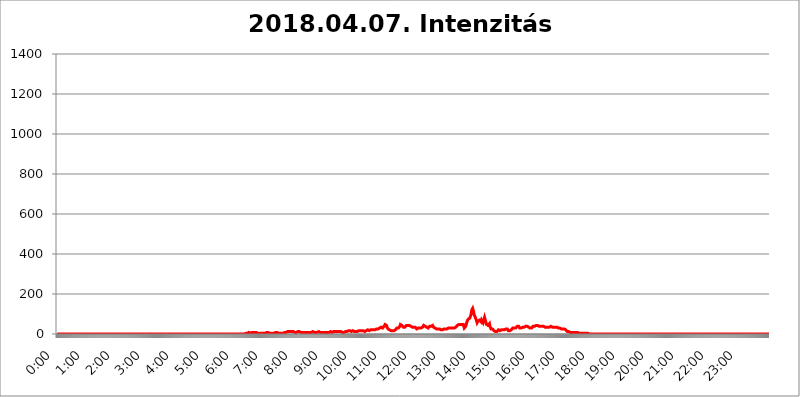
| Category | 2018.04.07. Intenzitás [W/m^2] |
|---|---|
| 0.0 | 0 |
| 0.0006944444444444445 | 0 |
| 0.001388888888888889 | 0 |
| 0.0020833333333333333 | 0 |
| 0.002777777777777778 | 0 |
| 0.003472222222222222 | 0 |
| 0.004166666666666667 | 0 |
| 0.004861111111111111 | 0 |
| 0.005555555555555556 | 0 |
| 0.0062499999999999995 | 0 |
| 0.006944444444444444 | 0 |
| 0.007638888888888889 | 0 |
| 0.008333333333333333 | 0 |
| 0.009027777777777779 | 0 |
| 0.009722222222222222 | 0 |
| 0.010416666666666666 | 0 |
| 0.011111111111111112 | 0 |
| 0.011805555555555555 | 0 |
| 0.012499999999999999 | 0 |
| 0.013194444444444444 | 0 |
| 0.013888888888888888 | 0 |
| 0.014583333333333332 | 0 |
| 0.015277777777777777 | 0 |
| 0.015972222222222224 | 0 |
| 0.016666666666666666 | 0 |
| 0.017361111111111112 | 0 |
| 0.018055555555555557 | 0 |
| 0.01875 | 0 |
| 0.019444444444444445 | 0 |
| 0.02013888888888889 | 0 |
| 0.020833333333333332 | 0 |
| 0.02152777777777778 | 0 |
| 0.022222222222222223 | 0 |
| 0.02291666666666667 | 0 |
| 0.02361111111111111 | 0 |
| 0.024305555555555556 | 0 |
| 0.024999999999999998 | 0 |
| 0.025694444444444447 | 0 |
| 0.02638888888888889 | 0 |
| 0.027083333333333334 | 0 |
| 0.027777777777777776 | 0 |
| 0.02847222222222222 | 0 |
| 0.029166666666666664 | 0 |
| 0.029861111111111113 | 0 |
| 0.030555555555555555 | 0 |
| 0.03125 | 0 |
| 0.03194444444444445 | 0 |
| 0.03263888888888889 | 0 |
| 0.03333333333333333 | 0 |
| 0.034027777777777775 | 0 |
| 0.034722222222222224 | 0 |
| 0.035416666666666666 | 0 |
| 0.036111111111111115 | 0 |
| 0.03680555555555556 | 0 |
| 0.0375 | 0 |
| 0.03819444444444444 | 0 |
| 0.03888888888888889 | 0 |
| 0.03958333333333333 | 0 |
| 0.04027777777777778 | 0 |
| 0.04097222222222222 | 0 |
| 0.041666666666666664 | 0 |
| 0.042361111111111106 | 0 |
| 0.04305555555555556 | 0 |
| 0.043750000000000004 | 0 |
| 0.044444444444444446 | 0 |
| 0.04513888888888889 | 0 |
| 0.04583333333333334 | 0 |
| 0.04652777777777778 | 0 |
| 0.04722222222222222 | 0 |
| 0.04791666666666666 | 0 |
| 0.04861111111111111 | 0 |
| 0.049305555555555554 | 0 |
| 0.049999999999999996 | 0 |
| 0.05069444444444445 | 0 |
| 0.051388888888888894 | 0 |
| 0.052083333333333336 | 0 |
| 0.05277777777777778 | 0 |
| 0.05347222222222222 | 0 |
| 0.05416666666666667 | 0 |
| 0.05486111111111111 | 0 |
| 0.05555555555555555 | 0 |
| 0.05625 | 0 |
| 0.05694444444444444 | 0 |
| 0.057638888888888885 | 0 |
| 0.05833333333333333 | 0 |
| 0.05902777777777778 | 0 |
| 0.059722222222222225 | 0 |
| 0.06041666666666667 | 0 |
| 0.061111111111111116 | 0 |
| 0.06180555555555556 | 0 |
| 0.0625 | 0 |
| 0.06319444444444444 | 0 |
| 0.06388888888888888 | 0 |
| 0.06458333333333334 | 0 |
| 0.06527777777777778 | 0 |
| 0.06597222222222222 | 0 |
| 0.06666666666666667 | 0 |
| 0.06736111111111111 | 0 |
| 0.06805555555555555 | 0 |
| 0.06874999999999999 | 0 |
| 0.06944444444444443 | 0 |
| 0.07013888888888889 | 0 |
| 0.07083333333333333 | 0 |
| 0.07152777777777779 | 0 |
| 0.07222222222222223 | 0 |
| 0.07291666666666667 | 0 |
| 0.07361111111111111 | 0 |
| 0.07430555555555556 | 0 |
| 0.075 | 0 |
| 0.07569444444444444 | 0 |
| 0.0763888888888889 | 0 |
| 0.07708333333333334 | 0 |
| 0.07777777777777778 | 0 |
| 0.07847222222222222 | 0 |
| 0.07916666666666666 | 0 |
| 0.0798611111111111 | 0 |
| 0.08055555555555556 | 0 |
| 0.08125 | 0 |
| 0.08194444444444444 | 0 |
| 0.08263888888888889 | 0 |
| 0.08333333333333333 | 0 |
| 0.08402777777777777 | 0 |
| 0.08472222222222221 | 0 |
| 0.08541666666666665 | 0 |
| 0.08611111111111112 | 0 |
| 0.08680555555555557 | 0 |
| 0.08750000000000001 | 0 |
| 0.08819444444444445 | 0 |
| 0.08888888888888889 | 0 |
| 0.08958333333333333 | 0 |
| 0.09027777777777778 | 0 |
| 0.09097222222222222 | 0 |
| 0.09166666666666667 | 0 |
| 0.09236111111111112 | 0 |
| 0.09305555555555556 | 0 |
| 0.09375 | 0 |
| 0.09444444444444444 | 0 |
| 0.09513888888888888 | 0 |
| 0.09583333333333333 | 0 |
| 0.09652777777777777 | 0 |
| 0.09722222222222222 | 0 |
| 0.09791666666666667 | 0 |
| 0.09861111111111111 | 0 |
| 0.09930555555555555 | 0 |
| 0.09999999999999999 | 0 |
| 0.10069444444444443 | 0 |
| 0.1013888888888889 | 0 |
| 0.10208333333333335 | 0 |
| 0.10277777777777779 | 0 |
| 0.10347222222222223 | 0 |
| 0.10416666666666667 | 0 |
| 0.10486111111111111 | 0 |
| 0.10555555555555556 | 0 |
| 0.10625 | 0 |
| 0.10694444444444444 | 0 |
| 0.1076388888888889 | 0 |
| 0.10833333333333334 | 0 |
| 0.10902777777777778 | 0 |
| 0.10972222222222222 | 0 |
| 0.1111111111111111 | 0 |
| 0.11180555555555556 | 0 |
| 0.11180555555555556 | 0 |
| 0.1125 | 0 |
| 0.11319444444444444 | 0 |
| 0.11388888888888889 | 0 |
| 0.11458333333333333 | 0 |
| 0.11527777777777777 | 0 |
| 0.11597222222222221 | 0 |
| 0.11666666666666665 | 0 |
| 0.1173611111111111 | 0 |
| 0.11805555555555557 | 0 |
| 0.11944444444444445 | 0 |
| 0.12013888888888889 | 0 |
| 0.12083333333333333 | 0 |
| 0.12152777777777778 | 0 |
| 0.12222222222222223 | 0 |
| 0.12291666666666667 | 0 |
| 0.12291666666666667 | 0 |
| 0.12361111111111112 | 0 |
| 0.12430555555555556 | 0 |
| 0.125 | 0 |
| 0.12569444444444444 | 0 |
| 0.12638888888888888 | 0 |
| 0.12708333333333333 | 0 |
| 0.16875 | 0 |
| 0.12847222222222224 | 0 |
| 0.12916666666666668 | 0 |
| 0.12986111111111112 | 0 |
| 0.13055555555555556 | 0 |
| 0.13125 | 0 |
| 0.13194444444444445 | 0 |
| 0.1326388888888889 | 0 |
| 0.13333333333333333 | 0 |
| 0.13402777777777777 | 0 |
| 0.13402777777777777 | 0 |
| 0.13472222222222222 | 0 |
| 0.13541666666666666 | 0 |
| 0.1361111111111111 | 0 |
| 0.13749999999999998 | 0 |
| 0.13819444444444443 | 0 |
| 0.1388888888888889 | 0 |
| 0.13958333333333334 | 0 |
| 0.14027777777777778 | 0 |
| 0.14097222222222222 | 0 |
| 0.14166666666666666 | 0 |
| 0.1423611111111111 | 0 |
| 0.14305555555555557 | 0 |
| 0.14375000000000002 | 0 |
| 0.14444444444444446 | 0 |
| 0.1451388888888889 | 0 |
| 0.1451388888888889 | 0 |
| 0.14652777777777778 | 0 |
| 0.14722222222222223 | 0 |
| 0.14791666666666667 | 0 |
| 0.1486111111111111 | 0 |
| 0.14930555555555555 | 0 |
| 0.15 | 0 |
| 0.15069444444444444 | 0 |
| 0.15138888888888888 | 0 |
| 0.15208333333333332 | 0 |
| 0.15277777777777776 | 0 |
| 0.15347222222222223 | 0 |
| 0.15416666666666667 | 0 |
| 0.15486111111111112 | 0 |
| 0.15555555555555556 | 0 |
| 0.15625 | 0 |
| 0.15694444444444444 | 0 |
| 0.15763888888888888 | 0 |
| 0.15833333333333333 | 0 |
| 0.15902777777777777 | 0 |
| 0.15972222222222224 | 0 |
| 0.16041666666666668 | 0 |
| 0.16111111111111112 | 0 |
| 0.16180555555555556 | 0 |
| 0.1625 | 0 |
| 0.16319444444444445 | 0 |
| 0.1638888888888889 | 0 |
| 0.16458333333333333 | 0 |
| 0.16527777777777777 | 0 |
| 0.16597222222222222 | 0 |
| 0.16666666666666666 | 0 |
| 0.1673611111111111 | 0 |
| 0.16805555555555554 | 0 |
| 0.16874999999999998 | 0 |
| 0.16944444444444443 | 0 |
| 0.17013888888888887 | 0 |
| 0.1708333333333333 | 0 |
| 0.17152777777777775 | 0 |
| 0.17222222222222225 | 0 |
| 0.1729166666666667 | 0 |
| 0.17361111111111113 | 0 |
| 0.17430555555555557 | 0 |
| 0.17500000000000002 | 0 |
| 0.17569444444444446 | 0 |
| 0.1763888888888889 | 0 |
| 0.17708333333333334 | 0 |
| 0.17777777777777778 | 0 |
| 0.17847222222222223 | 0 |
| 0.17916666666666667 | 0 |
| 0.1798611111111111 | 0 |
| 0.18055555555555555 | 0 |
| 0.18125 | 0 |
| 0.18194444444444444 | 0 |
| 0.1826388888888889 | 0 |
| 0.18333333333333335 | 0 |
| 0.1840277777777778 | 0 |
| 0.18472222222222223 | 0 |
| 0.18541666666666667 | 0 |
| 0.18611111111111112 | 0 |
| 0.18680555555555556 | 0 |
| 0.1875 | 0 |
| 0.18819444444444444 | 0 |
| 0.18888888888888888 | 0 |
| 0.18958333333333333 | 0 |
| 0.19027777777777777 | 0 |
| 0.1909722222222222 | 0 |
| 0.19166666666666665 | 0 |
| 0.19236111111111112 | 0 |
| 0.19305555555555554 | 0 |
| 0.19375 | 0 |
| 0.19444444444444445 | 0 |
| 0.1951388888888889 | 0 |
| 0.19583333333333333 | 0 |
| 0.19652777777777777 | 0 |
| 0.19722222222222222 | 0 |
| 0.19791666666666666 | 0 |
| 0.1986111111111111 | 0 |
| 0.19930555555555554 | 0 |
| 0.19999999999999998 | 0 |
| 0.20069444444444443 | 0 |
| 0.20138888888888887 | 0 |
| 0.2020833333333333 | 0 |
| 0.2027777777777778 | 0 |
| 0.2034722222222222 | 0 |
| 0.2041666666666667 | 0 |
| 0.20486111111111113 | 0 |
| 0.20555555555555557 | 0 |
| 0.20625000000000002 | 0 |
| 0.20694444444444446 | 0 |
| 0.2076388888888889 | 0 |
| 0.20833333333333334 | 0 |
| 0.20902777777777778 | 0 |
| 0.20972222222222223 | 0 |
| 0.21041666666666667 | 0 |
| 0.2111111111111111 | 0 |
| 0.21180555555555555 | 0 |
| 0.2125 | 0 |
| 0.21319444444444444 | 0 |
| 0.2138888888888889 | 0 |
| 0.21458333333333335 | 0 |
| 0.2152777777777778 | 0 |
| 0.21597222222222223 | 0 |
| 0.21666666666666667 | 0 |
| 0.21736111111111112 | 0 |
| 0.21805555555555556 | 0 |
| 0.21875 | 0 |
| 0.21944444444444444 | 0 |
| 0.22013888888888888 | 0 |
| 0.22083333333333333 | 0 |
| 0.22152777777777777 | 0 |
| 0.2222222222222222 | 0 |
| 0.22291666666666665 | 0 |
| 0.2236111111111111 | 0 |
| 0.22430555555555556 | 0 |
| 0.225 | 0 |
| 0.22569444444444445 | 0 |
| 0.2263888888888889 | 0 |
| 0.22708333333333333 | 0 |
| 0.22777777777777777 | 0 |
| 0.22847222222222222 | 0 |
| 0.22916666666666666 | 0 |
| 0.2298611111111111 | 0 |
| 0.23055555555555554 | 0 |
| 0.23124999999999998 | 0 |
| 0.23194444444444443 | 0 |
| 0.23263888888888887 | 0 |
| 0.2333333333333333 | 0 |
| 0.2340277777777778 | 0 |
| 0.2347222222222222 | 0 |
| 0.2354166666666667 | 0 |
| 0.23611111111111113 | 0 |
| 0.23680555555555557 | 0 |
| 0.23750000000000002 | 0 |
| 0.23819444444444446 | 0 |
| 0.2388888888888889 | 0 |
| 0.23958333333333334 | 0 |
| 0.24027777777777778 | 0 |
| 0.24097222222222223 | 0 |
| 0.24166666666666667 | 0 |
| 0.2423611111111111 | 0 |
| 0.24305555555555555 | 0 |
| 0.24375 | 0 |
| 0.24444444444444446 | 0 |
| 0.24513888888888888 | 0 |
| 0.24583333333333335 | 0 |
| 0.2465277777777778 | 0 |
| 0.24722222222222223 | 0 |
| 0.24791666666666667 | 0 |
| 0.24861111111111112 | 0 |
| 0.24930555555555556 | 0 |
| 0.25 | 0 |
| 0.25069444444444444 | 0 |
| 0.2513888888888889 | 3.525 |
| 0.2520833333333333 | 0 |
| 0.25277777777777777 | 0 |
| 0.2534722222222222 | 3.525 |
| 0.25416666666666665 | 0 |
| 0.2548611111111111 | 0 |
| 0.2555555555555556 | 0 |
| 0.25625000000000003 | 0 |
| 0.2569444444444445 | 0 |
| 0.2576388888888889 | 0 |
| 0.25833333333333336 | 0 |
| 0.2590277777777778 | 0 |
| 0.25972222222222224 | 0 |
| 0.2604166666666667 | 0 |
| 0.2611111111111111 | 3.525 |
| 0.26180555555555557 | 3.525 |
| 0.2625 | 0 |
| 0.26319444444444445 | 3.525 |
| 0.2638888888888889 | 3.525 |
| 0.26458333333333334 | 3.525 |
| 0.2652777777777778 | 3.525 |
| 0.2659722222222222 | 3.525 |
| 0.26666666666666666 | 3.525 |
| 0.2673611111111111 | 7.887 |
| 0.26805555555555555 | 7.887 |
| 0.26875 | 7.887 |
| 0.26944444444444443 | 3.525 |
| 0.2701388888888889 | 7.887 |
| 0.2708333333333333 | 3.525 |
| 0.27152777777777776 | 3.525 |
| 0.2722222222222222 | 7.887 |
| 0.27291666666666664 | 7.887 |
| 0.2736111111111111 | 7.887 |
| 0.2743055555555555 | 7.887 |
| 0.27499999999999997 | 7.887 |
| 0.27569444444444446 | 7.887 |
| 0.27638888888888885 | 7.887 |
| 0.27708333333333335 | 7.887 |
| 0.2777777777777778 | 7.887 |
| 0.27847222222222223 | 7.887 |
| 0.2791666666666667 | 7.887 |
| 0.2798611111111111 | 7.887 |
| 0.28055555555555556 | 3.525 |
| 0.28125 | 3.525 |
| 0.28194444444444444 | 3.525 |
| 0.2826388888888889 | 3.525 |
| 0.2833333333333333 | 3.525 |
| 0.28402777777777777 | 3.525 |
| 0.2847222222222222 | 3.525 |
| 0.28541666666666665 | 3.525 |
| 0.28611111111111115 | 3.525 |
| 0.28680555555555554 | 3.525 |
| 0.28750000000000003 | 3.525 |
| 0.2881944444444445 | 3.525 |
| 0.2888888888888889 | 3.525 |
| 0.28958333333333336 | 3.525 |
| 0.2902777777777778 | 3.525 |
| 0.29097222222222224 | 3.525 |
| 0.2916666666666667 | 3.525 |
| 0.2923611111111111 | 7.887 |
| 0.29305555555555557 | 3.525 |
| 0.29375 | 7.887 |
| 0.29444444444444445 | 7.887 |
| 0.2951388888888889 | 7.887 |
| 0.29583333333333334 | 7.887 |
| 0.2965277777777778 | 7.887 |
| 0.2972222222222222 | 3.525 |
| 0.29791666666666666 | 3.525 |
| 0.2986111111111111 | 3.525 |
| 0.29930555555555555 | 3.525 |
| 0.3 | 3.525 |
| 0.30069444444444443 | 3.525 |
| 0.3013888888888889 | 3.525 |
| 0.3020833333333333 | 3.525 |
| 0.30277777777777776 | 3.525 |
| 0.3034722222222222 | 3.525 |
| 0.30416666666666664 | 3.525 |
| 0.3048611111111111 | 3.525 |
| 0.3055555555555555 | 7.887 |
| 0.30624999999999997 | 7.887 |
| 0.3069444444444444 | 7.887 |
| 0.3076388888888889 | 7.887 |
| 0.30833333333333335 | 7.887 |
| 0.3090277777777778 | 7.887 |
| 0.30972222222222223 | 3.525 |
| 0.3104166666666667 | 3.525 |
| 0.3111111111111111 | 3.525 |
| 0.31180555555555556 | 3.525 |
| 0.3125 | 3.525 |
| 0.31319444444444444 | 3.525 |
| 0.3138888888888889 | 3.525 |
| 0.3145833333333333 | 3.525 |
| 0.31527777777777777 | 3.525 |
| 0.3159722222222222 | 3.525 |
| 0.31666666666666665 | 3.525 |
| 0.31736111111111115 | 3.525 |
| 0.31805555555555554 | 7.887 |
| 0.31875000000000003 | 7.887 |
| 0.3194444444444445 | 7.887 |
| 0.3201388888888889 | 7.887 |
| 0.32083333333333336 | 7.887 |
| 0.3215277777777778 | 12.257 |
| 0.32222222222222224 | 12.257 |
| 0.3229166666666667 | 12.257 |
| 0.3236111111111111 | 12.257 |
| 0.32430555555555557 | 12.257 |
| 0.325 | 12.257 |
| 0.32569444444444445 | 12.257 |
| 0.3263888888888889 | 12.257 |
| 0.32708333333333334 | 12.257 |
| 0.3277777777777778 | 12.257 |
| 0.3284722222222222 | 12.257 |
| 0.32916666666666666 | 12.257 |
| 0.3298611111111111 | 12.257 |
| 0.33055555555555555 | 12.257 |
| 0.33125 | 12.257 |
| 0.33194444444444443 | 12.257 |
| 0.3326388888888889 | 12.257 |
| 0.3333333333333333 | 7.887 |
| 0.3340277777777778 | 12.257 |
| 0.3347222222222222 | 7.887 |
| 0.3354166666666667 | 7.887 |
| 0.3361111111111111 | 7.887 |
| 0.3368055555555556 | 12.257 |
| 0.33749999999999997 | 12.257 |
| 0.33819444444444446 | 12.257 |
| 0.33888888888888885 | 12.257 |
| 0.33958333333333335 | 12.257 |
| 0.34027777777777773 | 12.257 |
| 0.34097222222222223 | 12.257 |
| 0.3416666666666666 | 7.887 |
| 0.3423611111111111 | 7.887 |
| 0.3430555555555555 | 7.887 |
| 0.34375 | 7.887 |
| 0.3444444444444445 | 7.887 |
| 0.3451388888888889 | 7.887 |
| 0.3458333333333334 | 7.887 |
| 0.34652777777777777 | 7.887 |
| 0.34722222222222227 | 7.887 |
| 0.34791666666666665 | 7.887 |
| 0.34861111111111115 | 7.887 |
| 0.34930555555555554 | 7.887 |
| 0.35000000000000003 | 7.887 |
| 0.3506944444444444 | 7.887 |
| 0.3513888888888889 | 7.887 |
| 0.3520833333333333 | 7.887 |
| 0.3527777777777778 | 7.887 |
| 0.3534722222222222 | 7.887 |
| 0.3541666666666667 | 7.887 |
| 0.3548611111111111 | 7.887 |
| 0.35555555555555557 | 7.887 |
| 0.35625 | 7.887 |
| 0.35694444444444445 | 7.887 |
| 0.3576388888888889 | 7.887 |
| 0.35833333333333334 | 12.257 |
| 0.3590277777777778 | 7.887 |
| 0.3597222222222222 | 7.887 |
| 0.36041666666666666 | 7.887 |
| 0.3611111111111111 | 7.887 |
| 0.36180555555555555 | 7.887 |
| 0.3625 | 7.887 |
| 0.36319444444444443 | 7.887 |
| 0.3638888888888889 | 7.887 |
| 0.3645833333333333 | 7.887 |
| 0.3652777777777778 | 7.887 |
| 0.3659722222222222 | 7.887 |
| 0.3666666666666667 | 12.257 |
| 0.3673611111111111 | 7.887 |
| 0.3680555555555556 | 7.887 |
| 0.36874999999999997 | 7.887 |
| 0.36944444444444446 | 7.887 |
| 0.37013888888888885 | 7.887 |
| 0.37083333333333335 | 7.887 |
| 0.37152777777777773 | 7.887 |
| 0.37222222222222223 | 7.887 |
| 0.3729166666666666 | 7.887 |
| 0.3736111111111111 | 7.887 |
| 0.3743055555555555 | 7.887 |
| 0.375 | 7.887 |
| 0.3756944444444445 | 7.887 |
| 0.3763888888888889 | 7.887 |
| 0.3770833333333334 | 7.887 |
| 0.37777777777777777 | 7.887 |
| 0.37847222222222227 | 7.887 |
| 0.37916666666666665 | 7.887 |
| 0.37986111111111115 | 7.887 |
| 0.38055555555555554 | 7.887 |
| 0.38125000000000003 | 7.887 |
| 0.3819444444444444 | 12.257 |
| 0.3826388888888889 | 12.257 |
| 0.3833333333333333 | 12.257 |
| 0.3840277777777778 | 12.257 |
| 0.3847222222222222 | 12.257 |
| 0.3854166666666667 | 7.887 |
| 0.3861111111111111 | 7.887 |
| 0.38680555555555557 | 7.887 |
| 0.3875 | 12.257 |
| 0.38819444444444445 | 12.257 |
| 0.3888888888888889 | 12.257 |
| 0.38958333333333334 | 12.257 |
| 0.3902777777777778 | 12.257 |
| 0.3909722222222222 | 12.257 |
| 0.39166666666666666 | 12.257 |
| 0.3923611111111111 | 12.257 |
| 0.39305555555555555 | 12.257 |
| 0.39375 | 12.257 |
| 0.39444444444444443 | 12.257 |
| 0.3951388888888889 | 12.257 |
| 0.3958333333333333 | 12.257 |
| 0.3965277777777778 | 12.257 |
| 0.3972222222222222 | 12.257 |
| 0.3979166666666667 | 12.257 |
| 0.3986111111111111 | 7.887 |
| 0.3993055555555556 | 7.887 |
| 0.39999999999999997 | 7.887 |
| 0.40069444444444446 | 7.887 |
| 0.40138888888888885 | 7.887 |
| 0.40208333333333335 | 7.887 |
| 0.40277777777777773 | 7.887 |
| 0.40347222222222223 | 12.257 |
| 0.4041666666666666 | 12.257 |
| 0.4048611111111111 | 12.257 |
| 0.4055555555555555 | 12.257 |
| 0.40625 | 12.257 |
| 0.4069444444444445 | 12.257 |
| 0.4076388888888889 | 12.257 |
| 0.4083333333333334 | 16.636 |
| 0.40902777777777777 | 16.636 |
| 0.40972222222222227 | 16.636 |
| 0.41041666666666665 | 16.636 |
| 0.41111111111111115 | 16.636 |
| 0.41180555555555554 | 12.257 |
| 0.41250000000000003 | 12.257 |
| 0.4131944444444444 | 16.636 |
| 0.4138888888888889 | 12.257 |
| 0.4145833333333333 | 16.636 |
| 0.4152777777777778 | 12.257 |
| 0.4159722222222222 | 12.257 |
| 0.4166666666666667 | 12.257 |
| 0.4173611111111111 | 12.257 |
| 0.41805555555555557 | 12.257 |
| 0.41875 | 12.257 |
| 0.41944444444444445 | 12.257 |
| 0.4201388888888889 | 12.257 |
| 0.42083333333333334 | 12.257 |
| 0.4215277777777778 | 16.636 |
| 0.4222222222222222 | 16.636 |
| 0.42291666666666666 | 16.636 |
| 0.4236111111111111 | 16.636 |
| 0.42430555555555555 | 16.636 |
| 0.425 | 16.636 |
| 0.42569444444444443 | 16.636 |
| 0.4263888888888889 | 16.636 |
| 0.4270833333333333 | 16.636 |
| 0.4277777777777778 | 16.636 |
| 0.4284722222222222 | 16.636 |
| 0.4291666666666667 | 16.636 |
| 0.4298611111111111 | 12.257 |
| 0.4305555555555556 | 12.257 |
| 0.43124999999999997 | 12.257 |
| 0.43194444444444446 | 12.257 |
| 0.43263888888888885 | 16.636 |
| 0.43333333333333335 | 16.636 |
| 0.43402777777777773 | 16.636 |
| 0.43472222222222223 | 21.024 |
| 0.4354166666666666 | 21.024 |
| 0.4361111111111111 | 16.636 |
| 0.4368055555555555 | 16.636 |
| 0.4375 | 16.636 |
| 0.4381944444444445 | 16.636 |
| 0.4388888888888889 | 16.636 |
| 0.4395833333333334 | 21.024 |
| 0.44027777777777777 | 16.636 |
| 0.44097222222222227 | 16.636 |
| 0.44166666666666665 | 21.024 |
| 0.44236111111111115 | 21.024 |
| 0.44305555555555554 | 21.024 |
| 0.44375000000000003 | 21.024 |
| 0.4444444444444444 | 21.024 |
| 0.4451388888888889 | 21.024 |
| 0.4458333333333333 | 21.024 |
| 0.4465277777777778 | 25.419 |
| 0.4472222222222222 | 25.419 |
| 0.4479166666666667 | 25.419 |
| 0.4486111111111111 | 25.419 |
| 0.44930555555555557 | 25.419 |
| 0.45 | 25.419 |
| 0.45069444444444445 | 29.823 |
| 0.4513888888888889 | 29.823 |
| 0.45208333333333334 | 29.823 |
| 0.4527777777777778 | 29.823 |
| 0.4534722222222222 | 34.234 |
| 0.45416666666666666 | 34.234 |
| 0.4548611111111111 | 34.234 |
| 0.45555555555555555 | 34.234 |
| 0.45625 | 29.823 |
| 0.45694444444444443 | 29.823 |
| 0.4576388888888889 | 34.234 |
| 0.4583333333333333 | 38.653 |
| 0.4590277777777778 | 43.079 |
| 0.4597222222222222 | 47.511 |
| 0.4604166666666667 | 51.951 |
| 0.4611111111111111 | 47.511 |
| 0.4618055555555556 | 43.079 |
| 0.46249999999999997 | 34.234 |
| 0.46319444444444446 | 29.823 |
| 0.46388888888888885 | 25.419 |
| 0.46458333333333335 | 25.419 |
| 0.46527777777777773 | 21.024 |
| 0.46597222222222223 | 21.024 |
| 0.4666666666666666 | 21.024 |
| 0.4673611111111111 | 21.024 |
| 0.4680555555555555 | 16.636 |
| 0.46875 | 16.636 |
| 0.4694444444444445 | 16.636 |
| 0.4701388888888889 | 16.636 |
| 0.4708333333333334 | 16.636 |
| 0.47152777777777777 | 16.636 |
| 0.47222222222222227 | 16.636 |
| 0.47291666666666665 | 16.636 |
| 0.47361111111111115 | 21.024 |
| 0.47430555555555554 | 21.024 |
| 0.47500000000000003 | 25.419 |
| 0.4756944444444444 | 25.419 |
| 0.4763888888888889 | 29.823 |
| 0.4770833333333333 | 29.823 |
| 0.4777777777777778 | 29.823 |
| 0.4784722222222222 | 29.823 |
| 0.4791666666666667 | 29.823 |
| 0.4798611111111111 | 34.234 |
| 0.48055555555555557 | 38.653 |
| 0.48125 | 47.511 |
| 0.48194444444444445 | 51.951 |
| 0.4826388888888889 | 47.511 |
| 0.48333333333333334 | 43.079 |
| 0.4840277777777778 | 38.653 |
| 0.4847222222222222 | 38.653 |
| 0.48541666666666666 | 34.234 |
| 0.4861111111111111 | 34.234 |
| 0.48680555555555555 | 34.234 |
| 0.4875 | 34.234 |
| 0.48819444444444443 | 38.653 |
| 0.4888888888888889 | 38.653 |
| 0.4895833333333333 | 43.079 |
| 0.4902777777777778 | 43.079 |
| 0.4909722222222222 | 43.079 |
| 0.4916666666666667 | 43.079 |
| 0.4923611111111111 | 43.079 |
| 0.4930555555555556 | 43.079 |
| 0.49374999999999997 | 43.079 |
| 0.49444444444444446 | 43.079 |
| 0.49513888888888885 | 43.079 |
| 0.49583333333333335 | 38.653 |
| 0.49652777777777773 | 38.653 |
| 0.49722222222222223 | 38.653 |
| 0.4979166666666666 | 34.234 |
| 0.4986111111111111 | 34.234 |
| 0.4993055555555555 | 34.234 |
| 0.5 | 34.234 |
| 0.5006944444444444 | 34.234 |
| 0.5013888888888889 | 34.234 |
| 0.5020833333333333 | 34.234 |
| 0.5027777777777778 | 29.823 |
| 0.5034722222222222 | 29.823 |
| 0.5041666666666667 | 25.419 |
| 0.5048611111111111 | 25.419 |
| 0.5055555555555555 | 29.823 |
| 0.50625 | 29.823 |
| 0.5069444444444444 | 29.823 |
| 0.5076388888888889 | 29.823 |
| 0.5083333333333333 | 29.823 |
| 0.5090277777777777 | 29.823 |
| 0.5097222222222222 | 29.823 |
| 0.5104166666666666 | 29.823 |
| 0.5111111111111112 | 29.823 |
| 0.5118055555555555 | 29.823 |
| 0.5125000000000001 | 34.234 |
| 0.5131944444444444 | 38.653 |
| 0.513888888888889 | 43.079 |
| 0.5145833333333333 | 43.079 |
| 0.5152777777777778 | 38.653 |
| 0.5159722222222222 | 38.653 |
| 0.5166666666666667 | 34.234 |
| 0.517361111111111 | 34.234 |
| 0.5180555555555556 | 34.234 |
| 0.5187499999999999 | 29.823 |
| 0.5194444444444445 | 29.823 |
| 0.5201388888888888 | 29.823 |
| 0.5208333333333334 | 34.234 |
| 0.5215277777777778 | 34.234 |
| 0.5222222222222223 | 38.653 |
| 0.5229166666666667 | 38.653 |
| 0.5236111111111111 | 34.234 |
| 0.5243055555555556 | 38.653 |
| 0.525 | 38.653 |
| 0.5256944444444445 | 43.079 |
| 0.5263888888888889 | 43.079 |
| 0.5270833333333333 | 38.653 |
| 0.5277777777777778 | 34.234 |
| 0.5284722222222222 | 29.823 |
| 0.5291666666666667 | 34.234 |
| 0.5298611111111111 | 29.823 |
| 0.5305555555555556 | 29.823 |
| 0.53125 | 29.823 |
| 0.5319444444444444 | 25.419 |
| 0.5326388888888889 | 25.419 |
| 0.5333333333333333 | 25.419 |
| 0.5340277777777778 | 25.419 |
| 0.5347222222222222 | 25.419 |
| 0.5354166666666667 | 25.419 |
| 0.5361111111111111 | 25.419 |
| 0.5368055555555555 | 25.419 |
| 0.5375 | 25.419 |
| 0.5381944444444444 | 21.024 |
| 0.5388888888888889 | 21.024 |
| 0.5395833333333333 | 21.024 |
| 0.5402777777777777 | 21.024 |
| 0.5409722222222222 | 25.419 |
| 0.5416666666666666 | 25.419 |
| 0.5423611111111112 | 25.419 |
| 0.5430555555555555 | 25.419 |
| 0.5437500000000001 | 25.419 |
| 0.5444444444444444 | 25.419 |
| 0.545138888888889 | 25.419 |
| 0.5458333333333333 | 25.419 |
| 0.5465277777777778 | 25.419 |
| 0.5472222222222222 | 29.823 |
| 0.5479166666666667 | 29.823 |
| 0.548611111111111 | 29.823 |
| 0.5493055555555556 | 29.823 |
| 0.5499999999999999 | 29.823 |
| 0.5506944444444445 | 29.823 |
| 0.5513888888888888 | 29.823 |
| 0.5520833333333334 | 29.823 |
| 0.5527777777777778 | 29.823 |
| 0.5534722222222223 | 29.823 |
| 0.5541666666666667 | 29.823 |
| 0.5548611111111111 | 29.823 |
| 0.5555555555555556 | 29.823 |
| 0.55625 | 29.823 |
| 0.5569444444444445 | 29.823 |
| 0.5576388888888889 | 29.823 |
| 0.5583333333333333 | 29.823 |
| 0.5590277777777778 | 34.234 |
| 0.5597222222222222 | 38.653 |
| 0.5604166666666667 | 38.653 |
| 0.5611111111111111 | 43.079 |
| 0.5618055555555556 | 43.079 |
| 0.5625 | 43.079 |
| 0.5631944444444444 | 47.511 |
| 0.5638888888888889 | 47.511 |
| 0.5645833333333333 | 47.511 |
| 0.5652777777777778 | 47.511 |
| 0.5659722222222222 | 51.951 |
| 0.5666666666666667 | 51.951 |
| 0.5673611111111111 | 47.511 |
| 0.5680555555555555 | 43.079 |
| 0.56875 | 47.511 |
| 0.5694444444444444 | 47.511 |
| 0.5701388888888889 | 43.079 |
| 0.5708333333333333 | 29.823 |
| 0.5715277777777777 | 29.823 |
| 0.5722222222222222 | 34.234 |
| 0.5729166666666666 | 38.653 |
| 0.5736111111111112 | 47.511 |
| 0.5743055555555555 | 56.398 |
| 0.5750000000000001 | 65.31 |
| 0.5756944444444444 | 69.775 |
| 0.576388888888889 | 74.246 |
| 0.5770833333333333 | 74.246 |
| 0.5777777777777778 | 74.246 |
| 0.5784722222222222 | 78.722 |
| 0.5791666666666667 | 83.205 |
| 0.579861111111111 | 92.184 |
| 0.5805555555555556 | 101.184 |
| 0.5812499999999999 | 119.235 |
| 0.5819444444444445 | 114.716 |
| 0.5826388888888888 | 128.284 |
| 0.5833333333333334 | 119.235 |
| 0.5840277777777778 | 110.201 |
| 0.5847222222222223 | 96.682 |
| 0.5854166666666667 | 96.682 |
| 0.5861111111111111 | 96.682 |
| 0.5868055555555556 | 78.722 |
| 0.5875 | 74.246 |
| 0.5881944444444445 | 65.31 |
| 0.5888888888888889 | 56.398 |
| 0.5895833333333333 | 60.85 |
| 0.5902777777777778 | 65.31 |
| 0.5909722222222222 | 60.85 |
| 0.5916666666666667 | 65.31 |
| 0.5923611111111111 | 69.775 |
| 0.5930555555555556 | 65.31 |
| 0.59375 | 69.775 |
| 0.5944444444444444 | 60.85 |
| 0.5951388888888889 | 69.775 |
| 0.5958333333333333 | 69.775 |
| 0.5965277777777778 | 65.31 |
| 0.5972222222222222 | 56.398 |
| 0.5979166666666667 | 65.31 |
| 0.5986111111111111 | 69.775 |
| 0.5993055555555555 | 83.205 |
| 0.6 | 74.246 |
| 0.6006944444444444 | 65.31 |
| 0.6013888888888889 | 60.85 |
| 0.6020833333333333 | 47.511 |
| 0.6027777777777777 | 43.079 |
| 0.6034722222222222 | 43.079 |
| 0.6041666666666666 | 43.079 |
| 0.6048611111111112 | 47.511 |
| 0.6055555555555555 | 47.511 |
| 0.6062500000000001 | 51.951 |
| 0.6069444444444444 | 38.653 |
| 0.607638888888889 | 34.234 |
| 0.6083333333333333 | 25.419 |
| 0.6090277777777778 | 25.419 |
| 0.6097222222222222 | 25.419 |
| 0.6104166666666667 | 25.419 |
| 0.611111111111111 | 25.419 |
| 0.6118055555555556 | 25.419 |
| 0.6124999999999999 | 16.636 |
| 0.6131944444444445 | 21.024 |
| 0.6138888888888888 | 16.636 |
| 0.6145833333333334 | 12.257 |
| 0.6152777777777778 | 12.257 |
| 0.6159722222222223 | 12.257 |
| 0.6166666666666667 | 12.257 |
| 0.6173611111111111 | 12.257 |
| 0.6180555555555556 | 16.636 |
| 0.61875 | 21.024 |
| 0.6194444444444445 | 21.024 |
| 0.6201388888888889 | 16.636 |
| 0.6208333333333333 | 16.636 |
| 0.6215277777777778 | 21.024 |
| 0.6222222222222222 | 21.024 |
| 0.6229166666666667 | 21.024 |
| 0.6236111111111111 | 21.024 |
| 0.6243055555555556 | 21.024 |
| 0.625 | 21.024 |
| 0.6256944444444444 | 21.024 |
| 0.6263888888888889 | 21.024 |
| 0.6270833333333333 | 21.024 |
| 0.6277777777777778 | 25.419 |
| 0.6284722222222222 | 25.419 |
| 0.6291666666666667 | 25.419 |
| 0.6298611111111111 | 25.419 |
| 0.6305555555555555 | 25.419 |
| 0.63125 | 25.419 |
| 0.6319444444444444 | 21.024 |
| 0.6326388888888889 | 16.636 |
| 0.6333333333333333 | 16.636 |
| 0.6340277777777777 | 16.636 |
| 0.6347222222222222 | 16.636 |
| 0.6354166666666666 | 16.636 |
| 0.6361111111111112 | 16.636 |
| 0.6368055555555555 | 21.024 |
| 0.6375000000000001 | 21.024 |
| 0.6381944444444444 | 25.419 |
| 0.638888888888889 | 29.823 |
| 0.6395833333333333 | 29.823 |
| 0.6402777777777778 | 29.823 |
| 0.6409722222222222 | 29.823 |
| 0.6416666666666667 | 25.419 |
| 0.642361111111111 | 29.823 |
| 0.6430555555555556 | 29.823 |
| 0.6437499999999999 | 29.823 |
| 0.6444444444444445 | 34.234 |
| 0.6451388888888888 | 38.653 |
| 0.6458333333333334 | 38.653 |
| 0.6465277777777778 | 38.653 |
| 0.6472222222222223 | 38.653 |
| 0.6479166666666667 | 38.653 |
| 0.6486111111111111 | 29.823 |
| 0.6493055555555556 | 29.823 |
| 0.65 | 29.823 |
| 0.6506944444444445 | 29.823 |
| 0.6513888888888889 | 34.234 |
| 0.6520833333333333 | 34.234 |
| 0.6527777777777778 | 34.234 |
| 0.6534722222222222 | 38.653 |
| 0.6541666666666667 | 38.653 |
| 0.6548611111111111 | 34.234 |
| 0.6555555555555556 | 38.653 |
| 0.65625 | 38.653 |
| 0.6569444444444444 | 38.653 |
| 0.6576388888888889 | 38.653 |
| 0.6583333333333333 | 38.653 |
| 0.6590277777777778 | 38.653 |
| 0.6597222222222222 | 38.653 |
| 0.6604166666666667 | 38.653 |
| 0.6611111111111111 | 34.234 |
| 0.6618055555555555 | 29.823 |
| 0.6625 | 29.823 |
| 0.6631944444444444 | 29.823 |
| 0.6638888888888889 | 29.823 |
| 0.6645833333333333 | 29.823 |
| 0.6652777777777777 | 29.823 |
| 0.6659722222222222 | 25.419 |
| 0.6666666666666666 | 29.823 |
| 0.6673611111111111 | 38.653 |
| 0.6680555555555556 | 38.653 |
| 0.6687500000000001 | 34.234 |
| 0.6694444444444444 | 38.653 |
| 0.6701388888888888 | 38.653 |
| 0.6708333333333334 | 43.079 |
| 0.6715277777777778 | 43.079 |
| 0.6722222222222222 | 43.079 |
| 0.6729166666666666 | 43.079 |
| 0.6736111111111112 | 43.079 |
| 0.6743055555555556 | 43.079 |
| 0.6749999999999999 | 43.079 |
| 0.6756944444444444 | 38.653 |
| 0.6763888888888889 | 38.653 |
| 0.6770833333333334 | 38.653 |
| 0.6777777777777777 | 38.653 |
| 0.6784722222222223 | 38.653 |
| 0.6791666666666667 | 38.653 |
| 0.6798611111111111 | 38.653 |
| 0.6805555555555555 | 38.653 |
| 0.68125 | 38.653 |
| 0.6819444444444445 | 38.653 |
| 0.6826388888888889 | 38.653 |
| 0.6833333333333332 | 34.234 |
| 0.6840277777777778 | 34.234 |
| 0.6847222222222222 | 38.653 |
| 0.6854166666666667 | 38.653 |
| 0.686111111111111 | 34.234 |
| 0.6868055555555556 | 34.234 |
| 0.6875 | 34.234 |
| 0.6881944444444444 | 34.234 |
| 0.688888888888889 | 34.234 |
| 0.6895833333333333 | 34.234 |
| 0.6902777777777778 | 34.234 |
| 0.6909722222222222 | 34.234 |
| 0.6916666666666668 | 38.653 |
| 0.6923611111111111 | 38.653 |
| 0.6930555555555555 | 34.234 |
| 0.69375 | 34.234 |
| 0.6944444444444445 | 34.234 |
| 0.6951388888888889 | 34.234 |
| 0.6958333333333333 | 38.653 |
| 0.6965277777777777 | 34.234 |
| 0.6972222222222223 | 34.234 |
| 0.6979166666666666 | 38.653 |
| 0.6986111111111111 | 34.234 |
| 0.6993055555555556 | 38.653 |
| 0.7000000000000001 | 34.234 |
| 0.7006944444444444 | 34.234 |
| 0.7013888888888888 | 34.234 |
| 0.7020833333333334 | 29.823 |
| 0.7027777777777778 | 29.823 |
| 0.7034722222222222 | 29.823 |
| 0.7041666666666666 | 29.823 |
| 0.7048611111111112 | 29.823 |
| 0.7055555555555556 | 29.823 |
| 0.7062499999999999 | 25.419 |
| 0.7069444444444444 | 25.419 |
| 0.7076388888888889 | 25.419 |
| 0.7083333333333334 | 21.024 |
| 0.7090277777777777 | 25.419 |
| 0.7097222222222223 | 21.024 |
| 0.7104166666666667 | 25.419 |
| 0.7111111111111111 | 25.419 |
| 0.7118055555555555 | 21.024 |
| 0.7125 | 21.024 |
| 0.7131944444444445 | 21.024 |
| 0.7138888888888889 | 16.636 |
| 0.7145833333333332 | 16.636 |
| 0.7152777777777778 | 12.257 |
| 0.7159722222222222 | 12.257 |
| 0.7166666666666667 | 12.257 |
| 0.717361111111111 | 12.257 |
| 0.7180555555555556 | 12.257 |
| 0.71875 | 12.257 |
| 0.7194444444444444 | 7.887 |
| 0.720138888888889 | 7.887 |
| 0.7208333333333333 | 7.887 |
| 0.7215277777777778 | 7.887 |
| 0.7222222222222222 | 7.887 |
| 0.7229166666666668 | 7.887 |
| 0.7236111111111111 | 7.887 |
| 0.7243055555555555 | 7.887 |
| 0.725 | 7.887 |
| 0.7256944444444445 | 7.887 |
| 0.7263888888888889 | 7.887 |
| 0.7270833333333333 | 7.887 |
| 0.7277777777777777 | 7.887 |
| 0.7284722222222223 | 7.887 |
| 0.7291666666666666 | 7.887 |
| 0.7298611111111111 | 7.887 |
| 0.7305555555555556 | 7.887 |
| 0.7312500000000001 | 7.887 |
| 0.7319444444444444 | 3.525 |
| 0.7326388888888888 | 7.887 |
| 0.7333333333333334 | 7.887 |
| 0.7340277777777778 | 3.525 |
| 0.7347222222222222 | 3.525 |
| 0.7354166666666666 | 3.525 |
| 0.7361111111111112 | 3.525 |
| 0.7368055555555556 | 3.525 |
| 0.7374999999999999 | 3.525 |
| 0.7381944444444444 | 3.525 |
| 0.7388888888888889 | 3.525 |
| 0.7395833333333334 | 3.525 |
| 0.7402777777777777 | 3.525 |
| 0.7409722222222223 | 3.525 |
| 0.7416666666666667 | 3.525 |
| 0.7423611111111111 | 3.525 |
| 0.7430555555555555 | 3.525 |
| 0.74375 | 3.525 |
| 0.7444444444444445 | 3.525 |
| 0.7451388888888889 | 3.525 |
| 0.7458333333333332 | 0 |
| 0.7465277777777778 | 0 |
| 0.7472222222222222 | 0 |
| 0.7479166666666667 | 0 |
| 0.748611111111111 | 0 |
| 0.7493055555555556 | 0 |
| 0.75 | 0 |
| 0.7506944444444444 | 0 |
| 0.751388888888889 | 0 |
| 0.7520833333333333 | 0 |
| 0.7527777777777778 | 0 |
| 0.7534722222222222 | 0 |
| 0.7541666666666668 | 0 |
| 0.7548611111111111 | 0 |
| 0.7555555555555555 | 0 |
| 0.75625 | 0 |
| 0.7569444444444445 | 0 |
| 0.7576388888888889 | 0 |
| 0.7583333333333333 | 0 |
| 0.7590277777777777 | 0 |
| 0.7597222222222223 | 0 |
| 0.7604166666666666 | 0 |
| 0.7611111111111111 | 0 |
| 0.7618055555555556 | 0 |
| 0.7625000000000001 | 0 |
| 0.7631944444444444 | 0 |
| 0.7638888888888888 | 0 |
| 0.7645833333333334 | 0 |
| 0.7652777777777778 | 0 |
| 0.7659722222222222 | 0 |
| 0.7666666666666666 | 0 |
| 0.7673611111111112 | 0 |
| 0.7680555555555556 | 0 |
| 0.7687499999999999 | 0 |
| 0.7694444444444444 | 0 |
| 0.7701388888888889 | 0 |
| 0.7708333333333334 | 0 |
| 0.7715277777777777 | 0 |
| 0.7722222222222223 | 0 |
| 0.7729166666666667 | 0 |
| 0.7736111111111111 | 0 |
| 0.7743055555555555 | 0 |
| 0.775 | 0 |
| 0.7756944444444445 | 0 |
| 0.7763888888888889 | 0 |
| 0.7770833333333332 | 0 |
| 0.7777777777777778 | 0 |
| 0.7784722222222222 | 0 |
| 0.7791666666666667 | 0 |
| 0.779861111111111 | 0 |
| 0.7805555555555556 | 0 |
| 0.78125 | 0 |
| 0.7819444444444444 | 0 |
| 0.782638888888889 | 0 |
| 0.7833333333333333 | 0 |
| 0.7840277777777778 | 0 |
| 0.7847222222222222 | 0 |
| 0.7854166666666668 | 0 |
| 0.7861111111111111 | 0 |
| 0.7868055555555555 | 0 |
| 0.7875 | 0 |
| 0.7881944444444445 | 0 |
| 0.7888888888888889 | 0 |
| 0.7895833333333333 | 0 |
| 0.7902777777777777 | 0 |
| 0.7909722222222223 | 0 |
| 0.7916666666666666 | 0 |
| 0.7923611111111111 | 0 |
| 0.7930555555555556 | 0 |
| 0.7937500000000001 | 0 |
| 0.7944444444444444 | 0 |
| 0.7951388888888888 | 0 |
| 0.7958333333333334 | 0 |
| 0.7965277777777778 | 0 |
| 0.7972222222222222 | 0 |
| 0.7979166666666666 | 0 |
| 0.7986111111111112 | 0 |
| 0.7993055555555556 | 0 |
| 0.7999999999999999 | 0 |
| 0.8006944444444444 | 0 |
| 0.8013888888888889 | 0 |
| 0.8020833333333334 | 0 |
| 0.8027777777777777 | 0 |
| 0.8034722222222223 | 0 |
| 0.8041666666666667 | 0 |
| 0.8048611111111111 | 0 |
| 0.8055555555555555 | 0 |
| 0.80625 | 0 |
| 0.8069444444444445 | 0 |
| 0.8076388888888889 | 0 |
| 0.8083333333333332 | 0 |
| 0.8090277777777778 | 0 |
| 0.8097222222222222 | 0 |
| 0.8104166666666667 | 0 |
| 0.811111111111111 | 0 |
| 0.8118055555555556 | 0 |
| 0.8125 | 0 |
| 0.8131944444444444 | 0 |
| 0.813888888888889 | 0 |
| 0.8145833333333333 | 0 |
| 0.8152777777777778 | 0 |
| 0.8159722222222222 | 0 |
| 0.8166666666666668 | 0 |
| 0.8173611111111111 | 0 |
| 0.8180555555555555 | 0 |
| 0.81875 | 0 |
| 0.8194444444444445 | 0 |
| 0.8201388888888889 | 0 |
| 0.8208333333333333 | 0 |
| 0.8215277777777777 | 0 |
| 0.8222222222222223 | 0 |
| 0.8229166666666666 | 0 |
| 0.8236111111111111 | 0 |
| 0.8243055555555556 | 0 |
| 0.8250000000000001 | 0 |
| 0.8256944444444444 | 0 |
| 0.8263888888888888 | 0 |
| 0.8270833333333334 | 0 |
| 0.8277777777777778 | 0 |
| 0.8284722222222222 | 0 |
| 0.8291666666666666 | 0 |
| 0.8298611111111112 | 0 |
| 0.8305555555555556 | 0 |
| 0.8312499999999999 | 0 |
| 0.8319444444444444 | 0 |
| 0.8326388888888889 | 0 |
| 0.8333333333333334 | 0 |
| 0.8340277777777777 | 0 |
| 0.8347222222222223 | 0 |
| 0.8354166666666667 | 0 |
| 0.8361111111111111 | 0 |
| 0.8368055555555555 | 0 |
| 0.8375 | 0 |
| 0.8381944444444445 | 0 |
| 0.8388888888888889 | 0 |
| 0.8395833333333332 | 0 |
| 0.8402777777777778 | 0 |
| 0.8409722222222222 | 0 |
| 0.8416666666666667 | 0 |
| 0.842361111111111 | 0 |
| 0.8430555555555556 | 0 |
| 0.84375 | 0 |
| 0.8444444444444444 | 0 |
| 0.845138888888889 | 0 |
| 0.8458333333333333 | 0 |
| 0.8465277777777778 | 0 |
| 0.8472222222222222 | 0 |
| 0.8479166666666668 | 0 |
| 0.8486111111111111 | 0 |
| 0.8493055555555555 | 0 |
| 0.85 | 0 |
| 0.8506944444444445 | 0 |
| 0.8513888888888889 | 0 |
| 0.8520833333333333 | 0 |
| 0.8527777777777777 | 0 |
| 0.8534722222222223 | 0 |
| 0.8541666666666666 | 0 |
| 0.8548611111111111 | 0 |
| 0.8555555555555556 | 0 |
| 0.8562500000000001 | 0 |
| 0.8569444444444444 | 0 |
| 0.8576388888888888 | 0 |
| 0.8583333333333334 | 0 |
| 0.8590277777777778 | 0 |
| 0.8597222222222222 | 0 |
| 0.8604166666666666 | 0 |
| 0.8611111111111112 | 0 |
| 0.8618055555555556 | 0 |
| 0.8624999999999999 | 0 |
| 0.8631944444444444 | 0 |
| 0.8638888888888889 | 0 |
| 0.8645833333333334 | 0 |
| 0.8652777777777777 | 0 |
| 0.8659722222222223 | 0 |
| 0.8666666666666667 | 0 |
| 0.8673611111111111 | 0 |
| 0.8680555555555555 | 0 |
| 0.86875 | 0 |
| 0.8694444444444445 | 0 |
| 0.8701388888888889 | 0 |
| 0.8708333333333332 | 0 |
| 0.8715277777777778 | 0 |
| 0.8722222222222222 | 0 |
| 0.8729166666666667 | 0 |
| 0.873611111111111 | 0 |
| 0.8743055555555556 | 0 |
| 0.875 | 0 |
| 0.8756944444444444 | 0 |
| 0.876388888888889 | 0 |
| 0.8770833333333333 | 0 |
| 0.8777777777777778 | 0 |
| 0.8784722222222222 | 0 |
| 0.8791666666666668 | 0 |
| 0.8798611111111111 | 0 |
| 0.8805555555555555 | 0 |
| 0.88125 | 0 |
| 0.8819444444444445 | 0 |
| 0.8826388888888889 | 0 |
| 0.8833333333333333 | 0 |
| 0.8840277777777777 | 0 |
| 0.8847222222222223 | 0 |
| 0.8854166666666666 | 0 |
| 0.8861111111111111 | 0 |
| 0.8868055555555556 | 0 |
| 0.8875000000000001 | 0 |
| 0.8881944444444444 | 0 |
| 0.8888888888888888 | 0 |
| 0.8895833333333334 | 0 |
| 0.8902777777777778 | 0 |
| 0.8909722222222222 | 0 |
| 0.8916666666666666 | 0 |
| 0.8923611111111112 | 0 |
| 0.8930555555555556 | 0 |
| 0.8937499999999999 | 0 |
| 0.8944444444444444 | 0 |
| 0.8951388888888889 | 0 |
| 0.8958333333333334 | 0 |
| 0.8965277777777777 | 0 |
| 0.8972222222222223 | 0 |
| 0.8979166666666667 | 0 |
| 0.8986111111111111 | 0 |
| 0.8993055555555555 | 0 |
| 0.9 | 0 |
| 0.9006944444444445 | 0 |
| 0.9013888888888889 | 0 |
| 0.9020833333333332 | 0 |
| 0.9027777777777778 | 0 |
| 0.9034722222222222 | 0 |
| 0.9041666666666667 | 0 |
| 0.904861111111111 | 0 |
| 0.9055555555555556 | 0 |
| 0.90625 | 0 |
| 0.9069444444444444 | 0 |
| 0.907638888888889 | 0 |
| 0.9083333333333333 | 0 |
| 0.9090277777777778 | 0 |
| 0.9097222222222222 | 0 |
| 0.9104166666666668 | 0 |
| 0.9111111111111111 | 0 |
| 0.9118055555555555 | 0 |
| 0.9125 | 0 |
| 0.9131944444444445 | 0 |
| 0.9138888888888889 | 0 |
| 0.9145833333333333 | 0 |
| 0.9152777777777777 | 0 |
| 0.9159722222222223 | 0 |
| 0.9166666666666666 | 0 |
| 0.9173611111111111 | 0 |
| 0.9180555555555556 | 0 |
| 0.9187500000000001 | 0 |
| 0.9194444444444444 | 0 |
| 0.9201388888888888 | 0 |
| 0.9208333333333334 | 0 |
| 0.9215277777777778 | 0 |
| 0.9222222222222222 | 0 |
| 0.9229166666666666 | 0 |
| 0.9236111111111112 | 0 |
| 0.9243055555555556 | 0 |
| 0.9249999999999999 | 0 |
| 0.9256944444444444 | 0 |
| 0.9263888888888889 | 0 |
| 0.9270833333333334 | 0 |
| 0.9277777777777777 | 0 |
| 0.9284722222222223 | 0 |
| 0.9291666666666667 | 0 |
| 0.9298611111111111 | 0 |
| 0.9305555555555555 | 0 |
| 0.93125 | 0 |
| 0.9319444444444445 | 0 |
| 0.9326388888888889 | 0 |
| 0.9333333333333332 | 0 |
| 0.9340277777777778 | 0 |
| 0.9347222222222222 | 0 |
| 0.9354166666666667 | 0 |
| 0.936111111111111 | 0 |
| 0.9368055555555556 | 0 |
| 0.9375 | 0 |
| 0.9381944444444444 | 0 |
| 0.938888888888889 | 0 |
| 0.9395833333333333 | 0 |
| 0.9402777777777778 | 0 |
| 0.9409722222222222 | 0 |
| 0.9416666666666668 | 0 |
| 0.9423611111111111 | 0 |
| 0.9430555555555555 | 0 |
| 0.94375 | 0 |
| 0.9444444444444445 | 0 |
| 0.9451388888888889 | 0 |
| 0.9458333333333333 | 0 |
| 0.9465277777777777 | 0 |
| 0.9472222222222223 | 0 |
| 0.9479166666666666 | 0 |
| 0.9486111111111111 | 0 |
| 0.9493055555555556 | 0 |
| 0.9500000000000001 | 0 |
| 0.9506944444444444 | 0 |
| 0.9513888888888888 | 0 |
| 0.9520833333333334 | 0 |
| 0.9527777777777778 | 0 |
| 0.9534722222222222 | 0 |
| 0.9541666666666666 | 0 |
| 0.9548611111111112 | 0 |
| 0.9555555555555556 | 0 |
| 0.9562499999999999 | 0 |
| 0.9569444444444444 | 0 |
| 0.9576388888888889 | 0 |
| 0.9583333333333334 | 0 |
| 0.9590277777777777 | 0 |
| 0.9597222222222223 | 0 |
| 0.9604166666666667 | 0 |
| 0.9611111111111111 | 0 |
| 0.9618055555555555 | 0 |
| 0.9625 | 0 |
| 0.9631944444444445 | 0 |
| 0.9638888888888889 | 0 |
| 0.9645833333333332 | 0 |
| 0.9652777777777778 | 0 |
| 0.9659722222222222 | 0 |
| 0.9666666666666667 | 0 |
| 0.967361111111111 | 0 |
| 0.9680555555555556 | 0 |
| 0.96875 | 0 |
| 0.9694444444444444 | 0 |
| 0.970138888888889 | 0 |
| 0.9708333333333333 | 0 |
| 0.9715277777777778 | 0 |
| 0.9722222222222222 | 0 |
| 0.9729166666666668 | 0 |
| 0.9736111111111111 | 0 |
| 0.9743055555555555 | 0 |
| 0.975 | 0 |
| 0.9756944444444445 | 0 |
| 0.9763888888888889 | 0 |
| 0.9770833333333333 | 0 |
| 0.9777777777777777 | 0 |
| 0.9784722222222223 | 0 |
| 0.9791666666666666 | 0 |
| 0.9798611111111111 | 0 |
| 0.9805555555555556 | 0 |
| 0.9812500000000001 | 0 |
| 0.9819444444444444 | 0 |
| 0.9826388888888888 | 0 |
| 0.9833333333333334 | 0 |
| 0.9840277777777778 | 0 |
| 0.9847222222222222 | 0 |
| 0.9854166666666666 | 0 |
| 0.9861111111111112 | 0 |
| 0.9868055555555556 | 0 |
| 0.9874999999999999 | 0 |
| 0.9881944444444444 | 0 |
| 0.9888888888888889 | 0 |
| 0.9895833333333334 | 0 |
| 0.9902777777777777 | 0 |
| 0.9909722222222223 | 0 |
| 0.9916666666666667 | 0 |
| 0.9923611111111111 | 0 |
| 0.9930555555555555 | 0 |
| 0.99375 | 0 |
| 0.9944444444444445 | 0 |
| 0.9951388888888889 | 0 |
| 0.9958333333333332 | 0 |
| 0.9965277777777778 | 0 |
| 0.9972222222222222 | 0 |
| 0.9979166666666667 | 0 |
| 0.998611111111111 | 0 |
| 0.9993055555555556 | 0 |